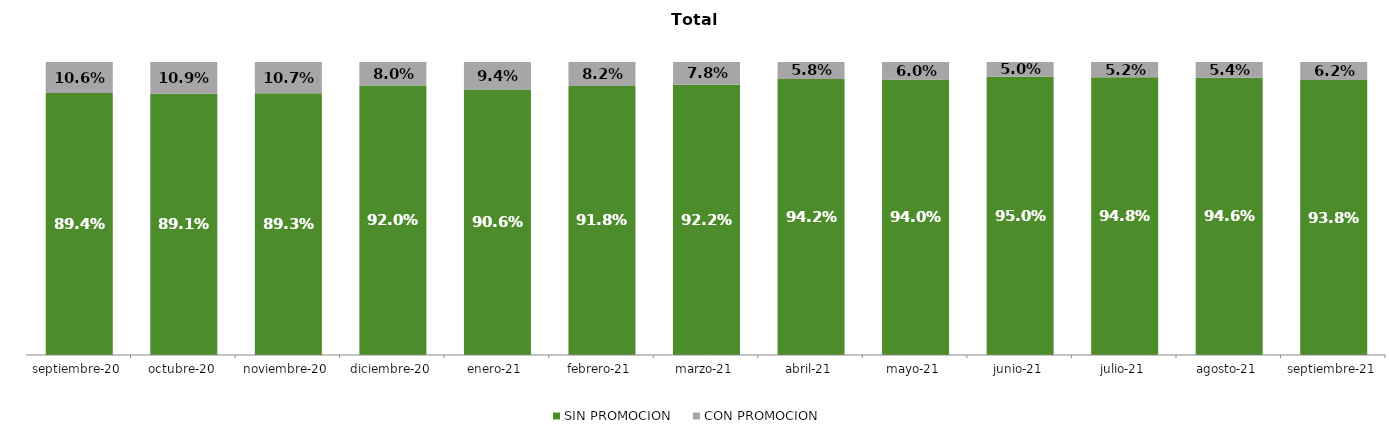
| Category | SIN PROMOCION   | CON PROMOCION   |
|---|---|---|
| 2020-09-01 | 0.894 | 0.106 |
| 2020-10-01 | 0.891 | 0.109 |
| 2020-11-01 | 0.893 | 0.107 |
| 2020-12-01 | 0.92 | 0.08 |
| 2021-01-01 | 0.906 | 0.094 |
| 2021-02-01 | 0.918 | 0.082 |
| 2021-03-01 | 0.922 | 0.078 |
| 2021-04-01 | 0.942 | 0.058 |
| 2021-05-01 | 0.94 | 0.06 |
| 2021-06-01 | 0.95 | 0.05 |
| 2021-07-01 | 0.948 | 0.052 |
| 2021-08-01 | 0.946 | 0.054 |
| 2021-09-01 | 0.938 | 0.062 |